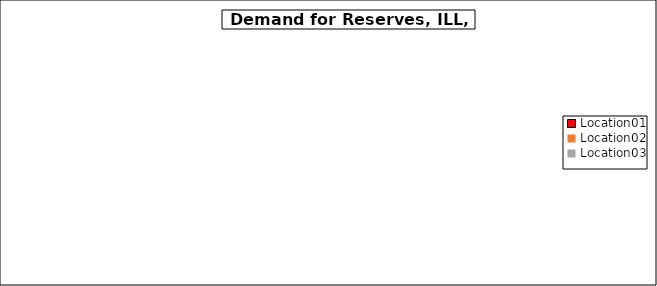
| Category | Series 0 |
|---|---|
| Location01 | 0 |
| Location02 | 0 |
| Location03 | 0 |